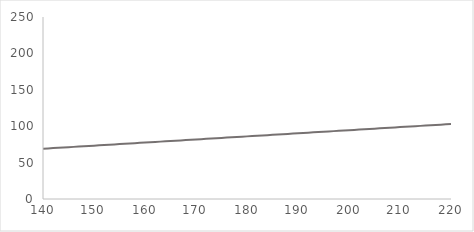
| Category | Series 0 |
|---|---|
| 140.0 | 69.057 |
| 141.0 | 69.481 |
| 142.0 | 69.905 |
| 143.0 | 70.329 |
| 144.0 | 70.754 |
| 145.0 | 71.178 |
| 146.0 | 71.602 |
| 147.0 | 72.026 |
| 148.0 | 72.45 |
| 149.0 | 72.875 |
| 150.0 | 73.299 |
| 151.0 | 73.723 |
| 152.0 | 74.147 |
| 153.0 | 74.571 |
| 154.0 | 74.996 |
| 155.0 | 75.42 |
| 156.0 | 75.844 |
| 157.0 | 76.268 |
| 158.0 | 76.692 |
| 159.0 | 77.116 |
| 160.0 | 77.541 |
| 161.0 | 77.965 |
| 162.0 | 78.389 |
| 163.0 | 78.813 |
| 164.0 | 79.237 |
| 165.0 | 79.662 |
| 166.0 | 80.086 |
| 167.0 | 80.51 |
| 168.0 | 80.934 |
| 169.0 | 81.358 |
| 170.0 | 81.783 |
| 171.0 | 82.207 |
| 172.0 | 82.631 |
| 173.0 | 83.055 |
| 174.0 | 83.479 |
| 175.0 | 83.903 |
| 176.0 | 84.328 |
| 177.0 | 84.752 |
| 178.0 | 85.176 |
| 179.0 | 85.6 |
| 180.0 | 86.024 |
| 181.0 | 86.449 |
| 182.0 | 86.873 |
| 183.0 | 87.297 |
| 184.0 | 87.721 |
| 185.0 | 88.145 |
| 186.0 | 88.57 |
| 187.0 | 88.994 |
| 188.0 | 89.418 |
| 189.0 | 89.842 |
| 190.0 | 90.266 |
| 191.0 | 90.69 |
| 192.0 | 91.115 |
| 193.0 | 91.539 |
| 194.0 | 91.963 |
| 195.0 | 92.387 |
| 196.0 | 92.811 |
| 197.0 | 93.236 |
| 198.0 | 93.66 |
| 199.0 | 94.084 |
| 200.0 | 94.508 |
| 201.0 | 94.932 |
| 202.0 | 95.357 |
| 203.0 | 95.781 |
| 204.0 | 96.205 |
| 205.0 | 96.629 |
| 206.0 | 97.053 |
| 207.0 | 97.477 |
| 208.0 | 97.902 |
| 209.0 | 98.326 |
| 210.0 | 98.75 |
| 211.0 | 99.174 |
| 212.0 | 99.598 |
| 213.0 | 100.023 |
| 214.0 | 100.447 |
| 215.0 | 100.871 |
| 216.0 | 101.295 |
| 217.0 | 101.719 |
| 218.0 | 102.144 |
| 219.0 | 102.568 |
| 220.0 | 102.992 |